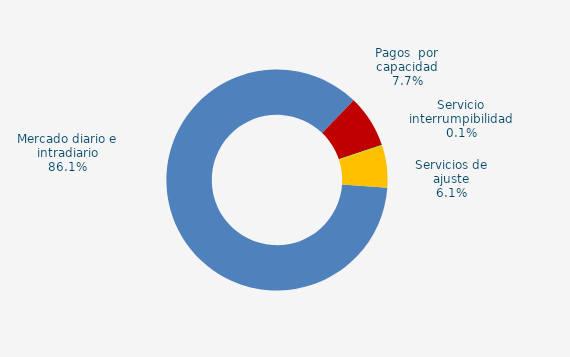
| Category | Series 0 |
|---|---|
| Mercado diario e intradiario | 30.96 |
| Pagos  por capacidad | 2.76 |
| Servicio interrumpibilidad | 0.04 |
| Servicios de ajuste | 2.21 |